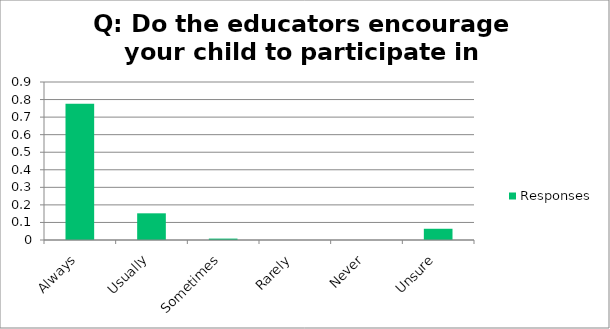
| Category | Responses |
|---|---|
| Always | 0.776 |
| Usually | 0.152 |
| Sometimes | 0.008 |
| Rarely | 0 |
| Never | 0 |
| Unsure | 0.064 |